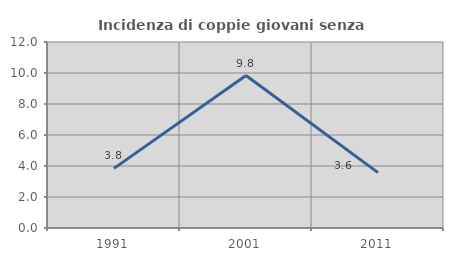
| Category | Incidenza di coppie giovani senza figli |
|---|---|
| 1991.0 | 3.846 |
| 2001.0 | 9.836 |
| 2011.0 | 3.571 |